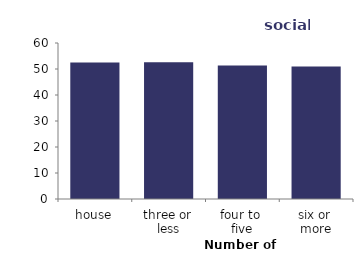
| Category | social |
|---|---|
| house | 52.496 |
| three or 
less | 52.604 |
| four to 
five | 51.319 |
| six or 
more | 51.009 |